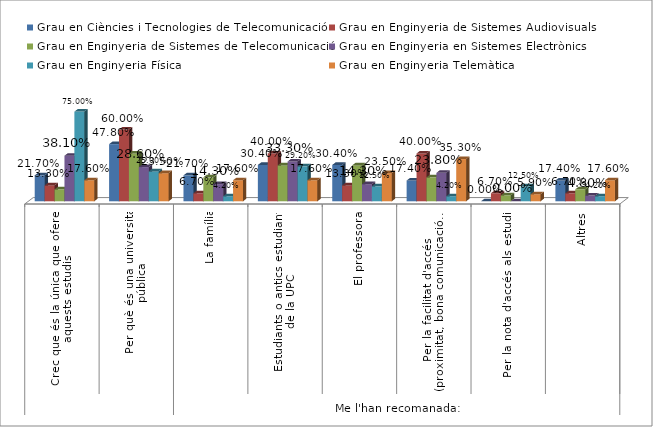
| Category | Grau en Ciències i Tecnologies de Telecomunicació | Grau en Enginyeria de Sistemes Audiovisuals | Grau en Enginyeria de Sistemes de Telecomunicació | Grau en Enginyeria en Sistemes Electrònics | Grau en Enginyeria Física | Grau en Enginyeria Telemàtica |
|---|---|---|---|---|---|---|
| 0 | 0.217 | 0.133 | 0.1 | 0.381 | 0.75 | 0.176 |
| 1 | 0.478 | 0.6 | 0.4 | 0.286 | 0.25 | 0.235 |
| 2 | 0.217 | 0.067 | 0.2 | 0.143 | 0.042 | 0.176 |
| 3 | 0.304 | 0.4 | 0.3 | 0.333 | 0.292 | 0.176 |
| 4 | 0.304 | 0.133 | 0.3 | 0.143 | 0.125 | 0.235 |
| 5 | 0.174 | 0.4 | 0.2 | 0.238 | 0.042 | 0.353 |
| 6 | 0 | 0.067 | 0.05 | 0 | 0.125 | 0.059 |
| 7 | 0.174 | 0.067 | 0.1 | 0.048 | 0.042 | 0.176 |